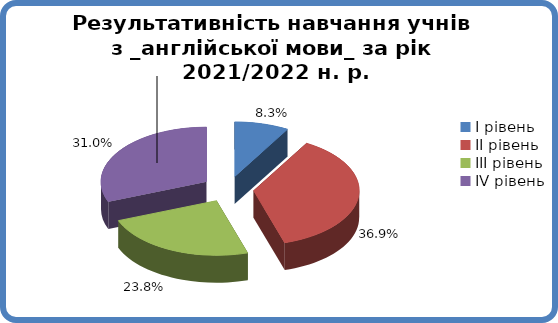
| Category | Series 0 |
|---|---|
| 0 | 0.083 |
| 1 | 0.369 |
| 2 | 0.238 |
| 3 | 0.31 |